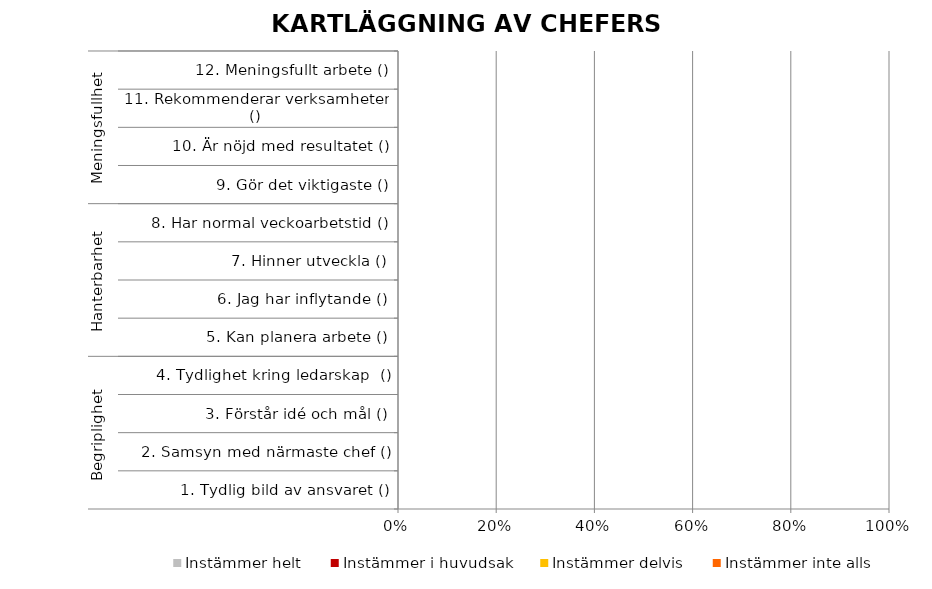
| Category | Instämmer helt | Instämmer i huvudsak | Instämmer delvis | Instämmer inte alls |
|---|---|---|---|---|
| 0 | 0 | 0 | 0 | 0 |
| 1 | 0 | 0 | 0 | 0 |
| 2 | 0 | 0 | 0 | 0 |
| 3 | 0 | 0 | 0 | 0 |
| 4 | 0 | 0 | 0 | 0 |
| 5 | 0 | 0 | 0 | 0 |
| 6 | 0 | 0 | 0 | 0 |
| 7 | 0 | 0 | 0 | 0 |
| 8 | 0 | 0 | 0 | 0 |
| 9 | 0 | 0 | 0 | 0 |
| 10 | 0 | 0 | 0 | 0 |
| 11 | 0 | 0 | 0 | 0 |